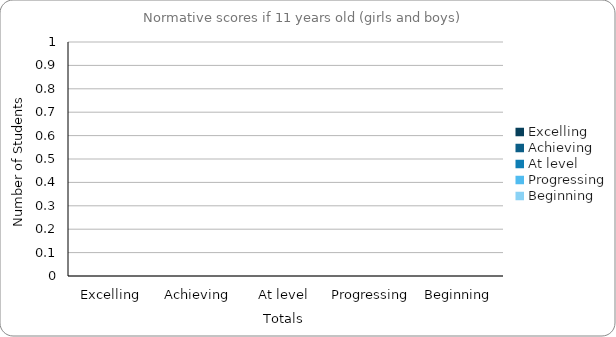
| Category | If 11 Years Old |
|---|---|
| Excelling | 0 |
| Achieving | 0 |
| At level | 0 |
| Progressing | 0 |
| Beginning | 0 |